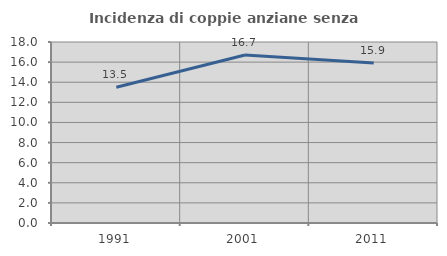
| Category | Incidenza di coppie anziane senza figli  |
|---|---|
| 1991.0 | 13.506 |
| 2001.0 | 16.701 |
| 2011.0 | 15.924 |